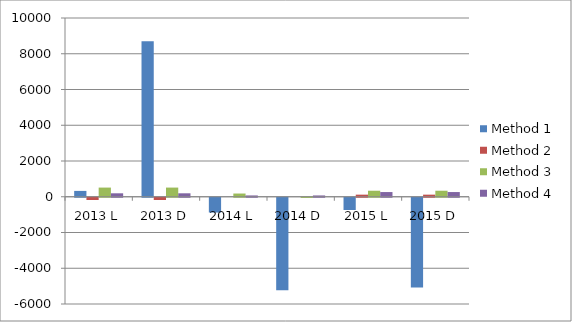
| Category | Method 1 | Method 2 | Method 3 | Method 4 |
|---|---|---|---|---|
| 2013 L | 327 | -127 | 513 | 193 |
| 2013 D | 8694 | -127 | 513 | 193 |
| 2014 L | -827 | 0 | 180 | 73 |
| 2014 D | -5181 | 0 | -11 | 73 |
| 2015 L | -686 | 117 | 337 | 263 |
| 2015 D | -5016 | 117 | 337 | 263 |